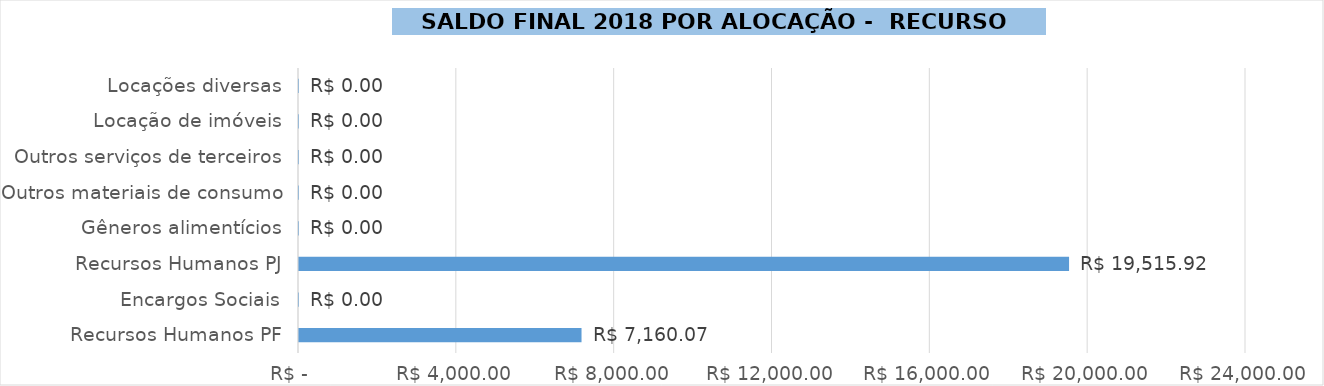
| Category | Saldo Final 2022 |
|---|---|
| Recursos Humanos PF | 7160.069 |
| Encargos Sociais | 0 |
| Recursos Humanos PJ | 19515.921 |
| Gêneros alimentícios | 0 |
| Outros materiais de consumo | 0 |
| Outros serviços de terceiros | 0 |
| Locação de imóveis | 0 |
| Locações diversas | 0 |